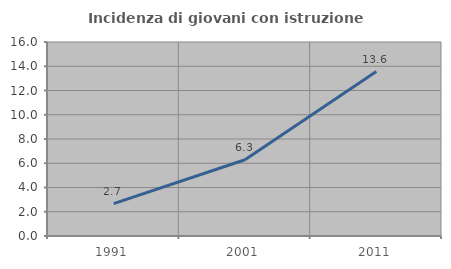
| Category | Incidenza di giovani con istruzione universitaria |
|---|---|
| 1991.0 | 2.67 |
| 2001.0 | 6.286 |
| 2011.0 | 13.564 |